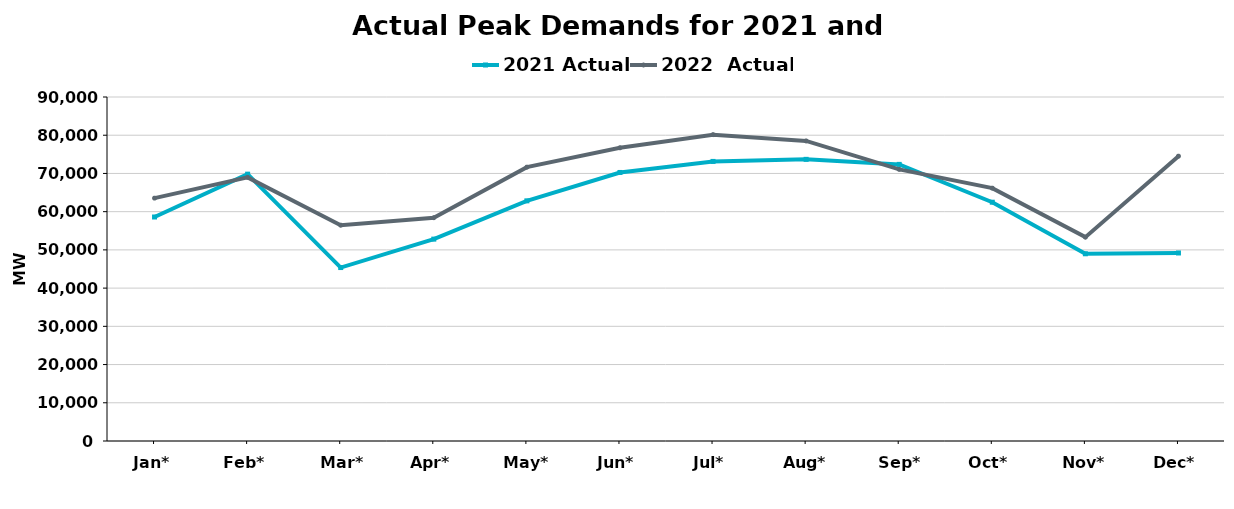
| Category | 2021 Actual | 2022  Actual |
|---|---|---|
| Jan* | 58606 | 63541 |
| Feb* | 69812 | 68968 |
| Mar* | 45380 | 56463 |
| Apr* | 52814 | 58419 |
| May* | 62832 | 71645 |
| Jun* | 70257 | 76718 |
| Jul* | 73145 | 80148 |
| Aug* | 73687 | 78505 |
| Sep* | 72370 | 71075 |
| Oct* | 62476 | 66153 |
| Nov* | 48983 | 53336 |
| Dec* | 49192 | 74525 |